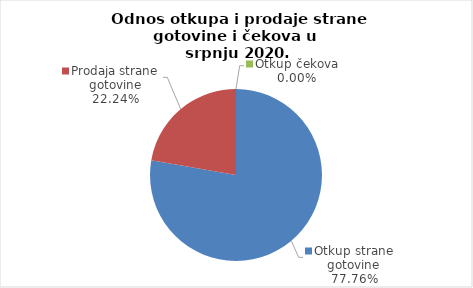
| Category | Series 0 |
|---|---|
| Otkup strane gotovine | 77.76 |
| Prodaja strane gotovine | 22.24 |
| Otkup čekova | 0 |